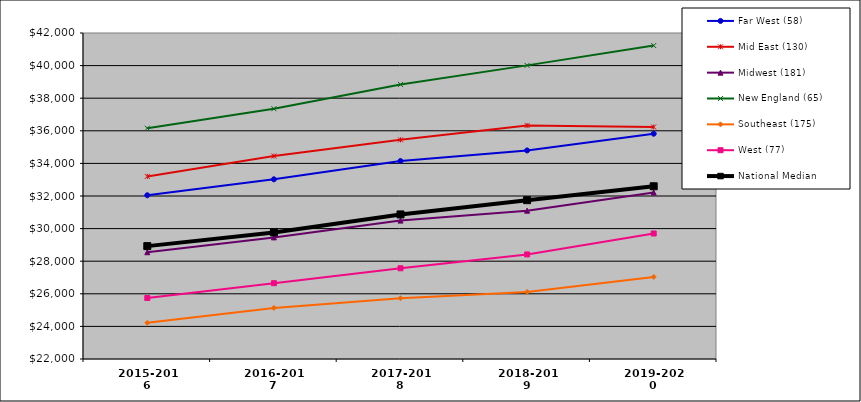
| Category | Far West (58) | Mid East (130) | Midwest (181) | New England (65) | Southeast (175) | West (77) | National Median |
|---|---|---|---|---|---|---|---|
| 2015-2016 | 32045 | 33200 | 28550 | 36160 | 24220 | 25742 | 28924.5 |
| 2016-2017 | 33024 | 34450 | 29460 | 37354 | 25135 | 26650 | 29767 |
| 2017-2018 | 34148 | 35445 | 30490 | 38844 | 25730 | 27566 | 30869 |
| 2018-2019 | 34795.5 | 36326 | 31100 | 40014 | 26116 | 28415 | 31745 |
| 2019-2020 | 35821 | 36235 | 32210 | 41230 | 27036 | 29700 | 32598 |